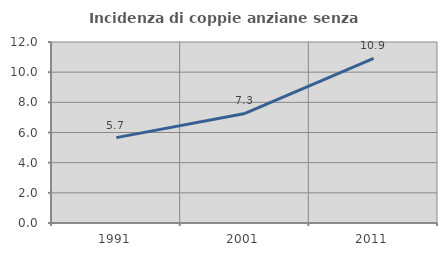
| Category | Incidenza di coppie anziane senza figli  |
|---|---|
| 1991.0 | 5.66 |
| 2001.0 | 7.266 |
| 2011.0 | 10.912 |